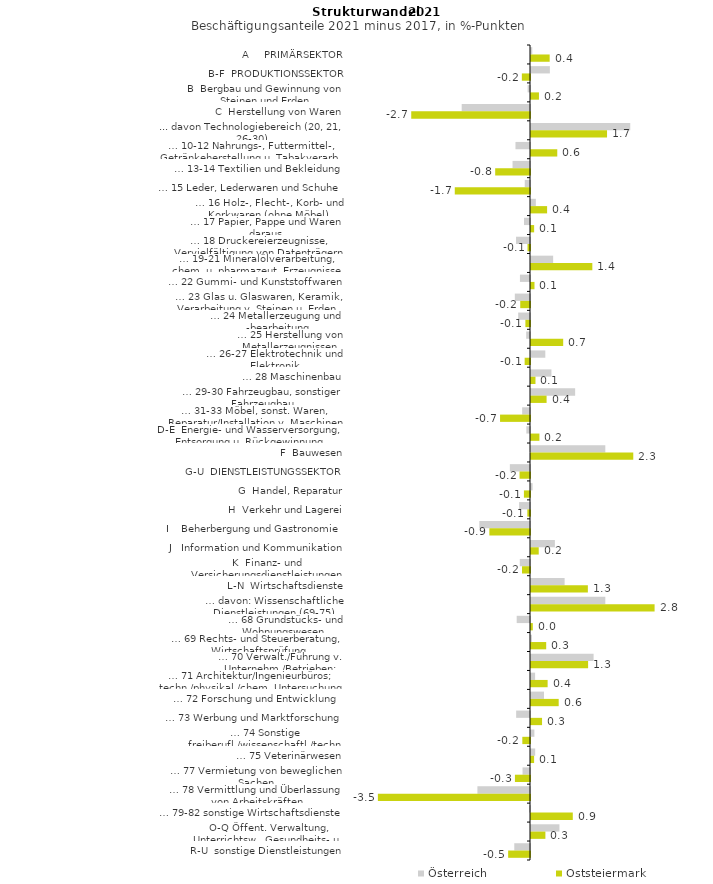
| Category | Österreich | Oststeiermark |
|---|---|---|
| A     PRIMÄRSEKTOR | 0.029 | 0.424 |
| B-F  PRODUKTIONSSEKTOR | 0.429 | -0.185 |
| B  Bergbau und Gewinnung von Steinen und Erden | -0.054 | 0.181 |
| C  Herstellung von Waren | -1.552 | -2.699 |
| ... davon Technologiebereich (20, 21, 26-30) | 2.256 | 1.728 |
| … 10-12 Nahrungs-, Futtermittel-, Getränkeherstellung u. Tabakverarb. | -0.33 | 0.597 |
| … 13-14 Textilien und Bekleidung | -0.397 | -0.791 |
| … 15 Leder, Lederwaren und Schuhe | -0.119 | -1.71 |
| … 16 Holz-, Flecht-, Korb- und Korkwaren (ohne Möbel)  | 0.11 | 0.366 |
| … 17 Papier, Pappe und Waren daraus  | -0.136 | 0.071 |
| … 18 Druckereierzeugnisse, Vervielfältigung von Datenträgern | -0.317 | -0.057 |
| … 19-21 Mineralölverarbeitung, chem. u. pharmazeut. Erzeugnisse | 0.503 | 1.394 |
| … 22 Gummi- und Kunststoffwaren | -0.229 | 0.079 |
| … 23 Glas u. Glaswaren, Keramik, Verarbeitung v. Steinen u. Erden  | -0.345 | -0.222 |
| … 24 Metallerzeugung und -bearbeitung | -0.269 | -0.105 |
| … 25 Herstellung von Metallerzeugnissen  | -0.086 | 0.731 |
| … 26-27 Elektrotechnik und Elektronik | 0.325 | -0.122 |
| … 28 Maschinenbau | 0.465 | 0.102 |
| … 29-30 Fahrzeugbau, sonstiger Fahrzeugbau | 1.003 | 0.354 |
| … 31-33 Möbel, sonst. Waren, Reparatur/Installation v. Maschinen | -0.178 | -0.681 |
| D-E  Energie- und Wasserversorgung, Entsorgung u. Rückgewinnung | -0.083 | 0.191 |
| F  Bauwesen | 1.689 | 2.324 |
| G-U  DIENSTLEISTUNGSSEKTOR | -0.458 | -0.238 |
| G  Handel, Reparatur | 0.035 | -0.138 |
| H  Verkehr und Lagerei | -0.247 | -0.061 |
| I    Beherbergung und Gastronomie | -1.152 | -0.924 |
| J   Information und Kommunikation | 0.543 | 0.176 |
| K  Finanz- und Versicherungsdienstleistungen | -0.232 | -0.181 |
| L-N  Wirtschaftsdienste | 0.764 | 1.292 |
| … davon: Wissenschaftliche Dienstleistungen (69-75) | 1.689 | 2.809 |
| … 68 Grundstücks- und Wohnungswesen  | -0.302 | 0.041 |
| … 69 Rechts- und Steuerberatung, Wirtschaftsprüfung | 0.021 | 0.345 |
| … 70 Verwalt./Führung v. Unternehm./Betrieben; Unternehmensberat. | 1.422 | 1.298 |
| … 71 Architektur/Ingenieurbüros; techn./physikal./chem. Untersuchung | 0.093 | 0.378 |
| … 72 Forschung und Entwicklung  | 0.296 | 0.629 |
| … 73 Werbung und Marktforschung | -0.315 | 0.251 |
| … 74 Sonstige freiberufl./wissenschaftl./techn. Tätigkeiten | 0.077 | -0.174 |
| … 75 Veterinärwesen | 0.095 | 0.071 |
| … 77 Vermietung von beweglichen Sachen  | -0.17 | -0.343 |
| … 78 Vermittlung und Überlassung von Arbeitskräften | -1.195 | -3.457 |
| … 79-82 sonstige Wirtschaftsdienste | -0.022 | 0.95 |
| O-Q Öffent. Verwaltung, Unterrichtsw., Gesundheits- u. Sozialwesen | 0.646 | 0.327 |
| R-U  sonstige Dienstleistungen | -0.357 | -0.497 |